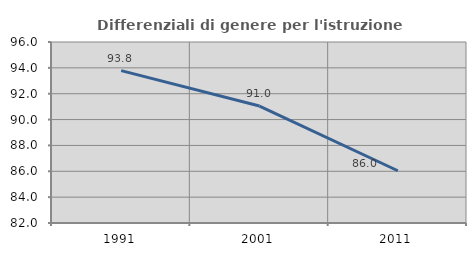
| Category | Differenziali di genere per l'istruzione superiore |
|---|---|
| 1991.0 | 93.789 |
| 2001.0 | 91.044 |
| 2011.0 | 86.043 |